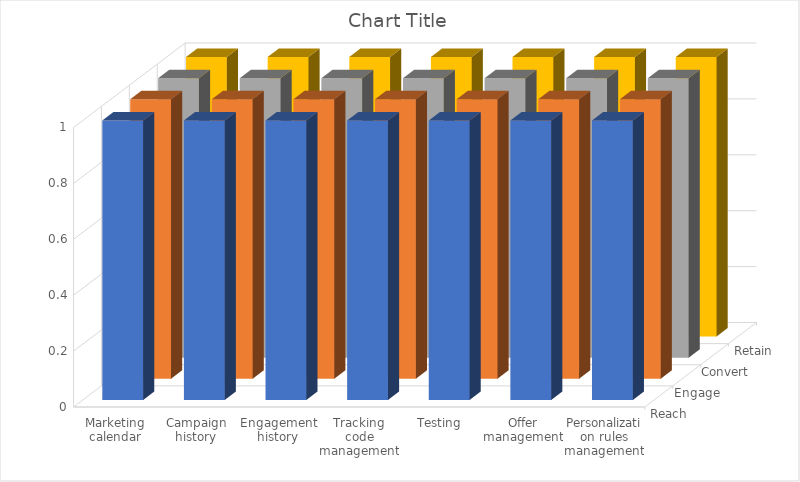
| Category | Reach | Engage | Convert | Retain |
|---|---|---|---|---|
| Marketing calendar | 1 | 1 | 1 | 1 |
| Campaign history | 1 | 1 | 1 | 1 |
| Engagement history | 1 | 1 | 1 | 1 |
| Tracking code management | 1 | 1 | 1 | 1 |
| Testing | 1 | 1 | 1 | 1 |
| Offer management | 1 | 1 | 1 | 1 |
| Personalization rules management | 1 | 1 | 1 | 1 |